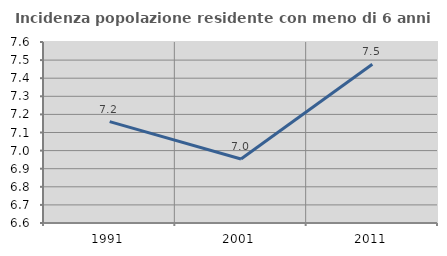
| Category | Incidenza popolazione residente con meno di 6 anni |
|---|---|
| 1991.0 | 7.16 |
| 2001.0 | 6.954 |
| 2011.0 | 7.478 |